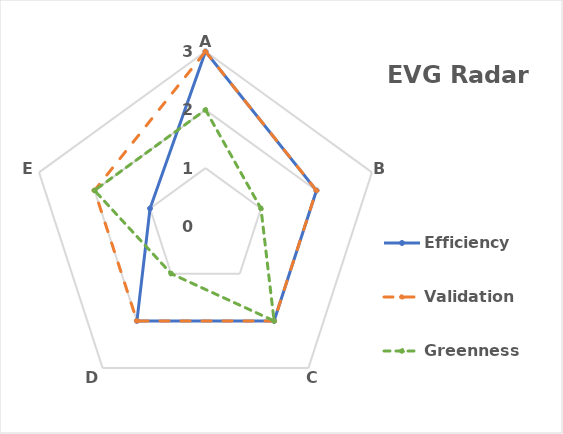
| Category | Efficiency | Validation | Greenness |
|---|---|---|---|
| A | 3 | 3 | 2 |
| B | 2 | 2 | 1 |
| C | 2 | 2 | 2 |
| D | 2 | 2 | 1 |
| E | 1 | 2 | 2 |